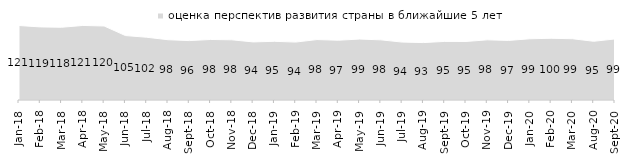
| Category | оценка перспектив развития страны в ближайшие 5 лет |
|---|---|
| 2018-01-01 | 120.9 |
| 2018-02-01 | 118.65 |
| 2018-03-01 | 118.1 |
| 2018-04-01 | 121 |
| 2018-05-01 | 120.15 |
| 2018-06-01 | 104.6 |
| 2018-07-01 | 101.85 |
| 2018-08-01 | 97.85 |
| 2018-09-01 | 96.4 |
| 2018-10-01 | 98.25 |
| 2018-11-01 | 97.705 |
| 2018-12-01 | 94.3 |
| 2019-01-01 | 95.25 |
| 2019-02-01 | 94.05 |
| 2019-03-01 | 98.11 |
| 2019-04-01 | 97.03 |
| 2019-05-01 | 98.91 |
| 2019-06-01 | 97.656 |
| 2019-07-01 | 94.01 |
| 2019-08-01 | 93.207 |
| 2019-09-01 | 95.099 |
| 2019-10-01 | 95 |
| 2019-11-01 | 97.673 |
| 2019-12-01 | 96.733 |
| 2020-01-01 | 99.356 |
| 2020-02-01 | 100.198 |
| 2020-03-01 | 99.455 |
| 2020-08-01 | 95.333 |
| 2020-09-01 | 99.054 |